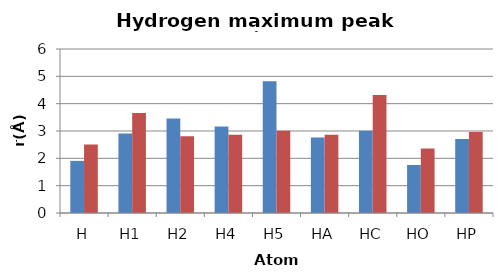
| Category | OW | HW |
|---|---|---|
| H | 1.906 | 2.508 |
| H1 | 2.91 | 3.662 |
| H2 | 3.462 | 2.809 |
| H4 | 3.16 | 2.86 |
| H5 | 4.816 | 3.01 |
| HA | 2.759 | 2.86 |
| HC | 3.01 | 4.314 |
| HO | 1.756 | 2.358 |
| HP | 2.709 | 2.96 |